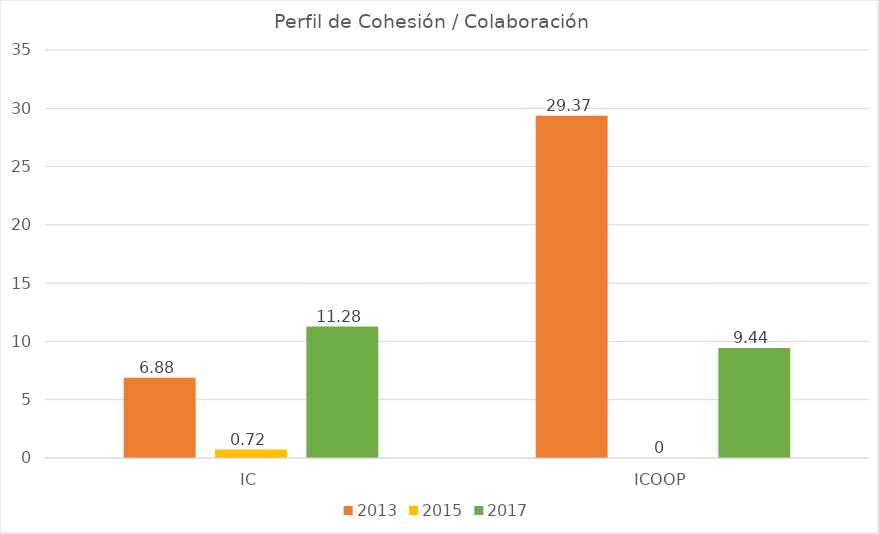
| Category | 2013 | 2015 | 2017 |
|---|---|---|---|
| IC | 6.88 | 0.72 | 11.28 |
| ICOOP | 29.37 | 0 | 9.44 |